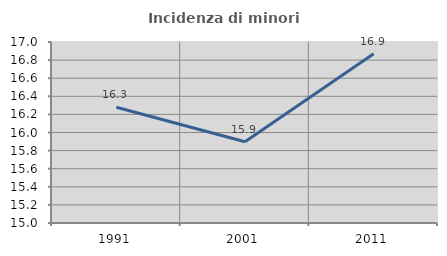
| Category | Incidenza di minori stranieri |
|---|---|
| 1991.0 | 16.279 |
| 2001.0 | 15.897 |
| 2011.0 | 16.871 |